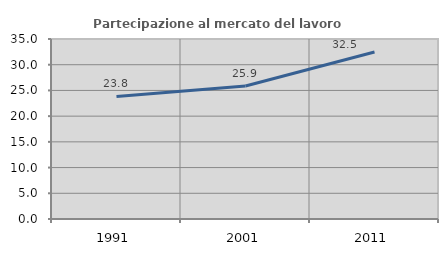
| Category | Partecipazione al mercato del lavoro  femminile |
|---|---|
| 1991.0 | 23.833 |
| 2001.0 | 25.876 |
| 2011.0 | 32.472 |